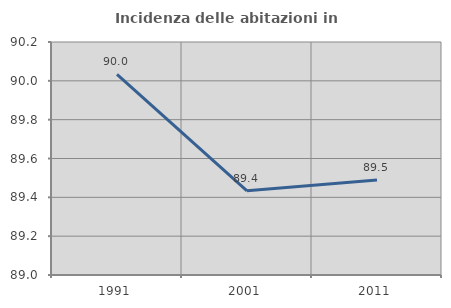
| Category | Incidenza delle abitazioni in proprietà  |
|---|---|
| 1991.0 | 90.034 |
| 2001.0 | 89.433 |
| 2011.0 | 89.489 |